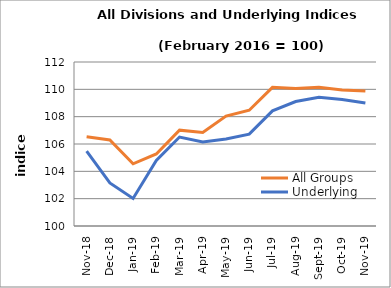
| Category | All Groups | Underlying |
|---|---|---|
| 2018-11-01 | 106.524 | 105.471 |
| 2018-12-01 | 106.292 | 103.148 |
| 2019-01-01 | 104.55 | 102.019 |
| 2019-02-01 | 105.272 | 104.794 |
| 2019-03-01 | 107.012 | 106.51 |
| 2019-04-01 | 106.842 | 106.143 |
| 2019-05-01 | 108.044 | 106.37 |
| 2019-06-01 | 108.473 | 106.721 |
| 2019-07-01 | 110.146 | 108.423 |
| 2019-08-01 | 110.057 | 109.11 |
| 2019-09-01 | 110.148 | 109.423 |
| 2019-10-01 | 109.943 | 109.256 |
| 2019-11-01 | 109.87 | 108.998 |